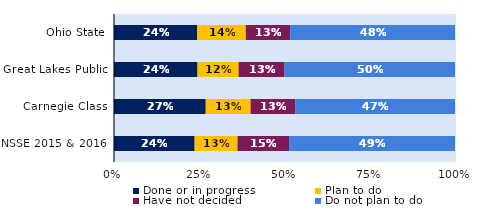
| Category | Done or in progress | Plan to do | Have not decided | Do not plan to do |
|---|---|---|---|---|
| Ohio State | 0.244 | 0.142 | 0.13 | 0.483 |
| Great Lakes Public | 0.245 | 0.121 | 0.135 | 0.5 |
| Carnegie Class | 0.269 | 0.132 | 0.132 | 0.468 |
| NSSE 2015 & 2016 | 0.236 | 0.126 | 0.151 | 0.487 |